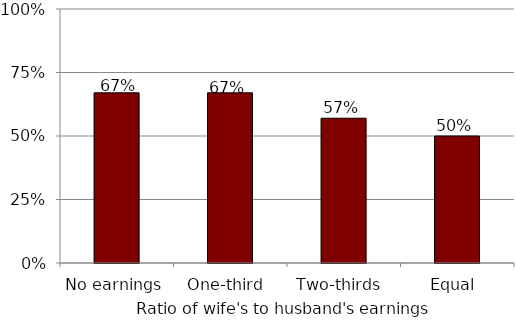
| Category | Ratio |
|---|---|
| No earnings | 0.67 |
| One-third  | 0.67 |
| Two-thirds  | 0.57 |
| Equal  | 0.5 |